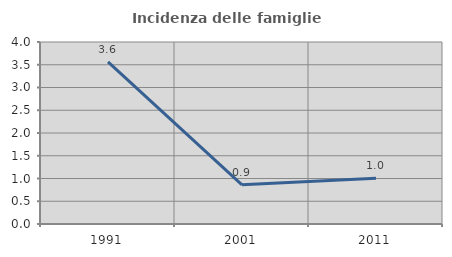
| Category | Incidenza delle famiglie numerose |
|---|---|
| 1991.0 | 3.562 |
| 2001.0 | 0.861 |
| 2011.0 | 1.008 |